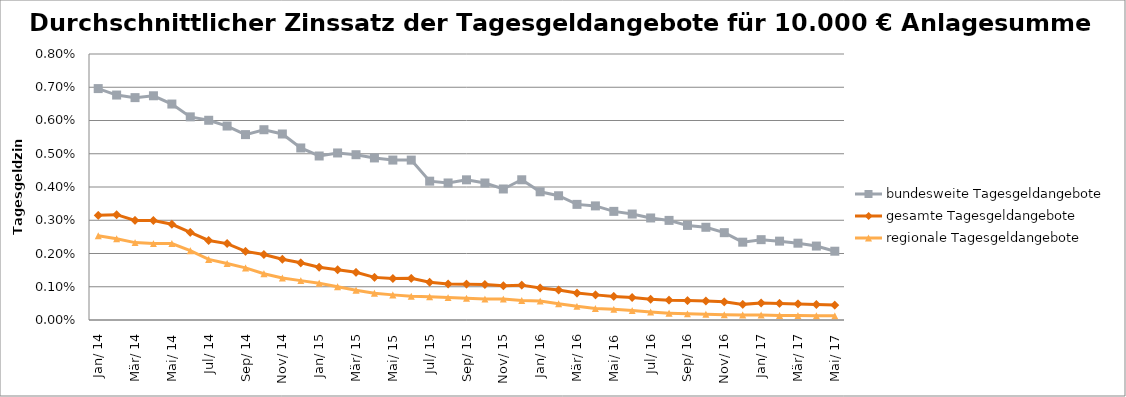
| Category | bundesweite Tagesgeldangebote | gesamte Tagesgeldangebote | regionale Tagesgeldangebote |
|---|---|---|---|
| 2014-01-01 | 0.007 | 0.003 | 0.003 |
| 2014-02-01 | 0.007 | 0.003 | 0.002 |
| 2014-03-01 | 0.007 | 0.003 | 0.002 |
| 2014-04-01 | 0.007 | 0.003 | 0.002 |
| 2014-05-01 | 0.006 | 0.003 | 0.002 |
| 2014-06-01 | 0.006 | 0.003 | 0.002 |
| 2014-07-01 | 0.006 | 0.002 | 0.002 |
| 2014-08-01 | 0.006 | 0.002 | 0.002 |
| 2014-09-01 | 0.006 | 0.002 | 0.002 |
| 2014-10-01 | 0.006 | 0.002 | 0.001 |
| 2014-11-01 | 0.006 | 0.002 | 0.001 |
| 2014-12-01 | 0.005 | 0.002 | 0.001 |
| 2015-01-01 | 0.005 | 0.002 | 0.001 |
| 2015-02-01 | 0.005 | 0.002 | 0.001 |
| 2015-03-01 | 0.005 | 0.001 | 0.001 |
| 2015-04-01 | 0.005 | 0.001 | 0.001 |
| 2015-05-01 | 0.005 | 0.001 | 0.001 |
| 2015-06-01 | 0.005 | 0.001 | 0.001 |
| 2015-07-01 | 0.004 | 0.001 | 0.001 |
| 2015-08-01 | 0.004 | 0.001 | 0.001 |
| 2015-09-01 | 0.004 | 0.001 | 0.001 |
| 2015-10-01 | 0.004 | 0.001 | 0.001 |
| 2015-11-01 | 0.004 | 0.001 | 0.001 |
| 2015-12-01 | 0.004 | 0.001 | 0.001 |
| 2016-01-01 | 0.004 | 0.001 | 0.001 |
| 2016-02-01 | 0.004 | 0.001 | 0 |
| 2016-03-01 | 0.003 | 0.001 | 0 |
| 2016-04-01 | 0.003 | 0.001 | 0 |
| 2016-05-01 | 0.003 | 0.001 | 0 |
| 2016-06-01 | 0.003 | 0.001 | 0 |
| 2016-07-01 | 0.003 | 0.001 | 0 |
| 2016-08-01 | 0.003 | 0.001 | 0 |
| 2016-09-01 | 0.003 | 0.001 | 0 |
| 2016-10-01 | 0.003 | 0.001 | 0 |
| 2016-11-01 | 0.003 | 0.001 | 0 |
| 2016-12-01 | 0.002 | 0 | 0 |
| 2017-01-01 | 0.002 | 0.001 | 0 |
| 2017-02-01 | 0.002 | 0 | 0 |
| 2017-03-01 | 0.002 | 0 | 0 |
| 2017-04-01 | 0.002 | 0 | 0 |
| 2017-05-01 | 0.002 | 0 | 0 |